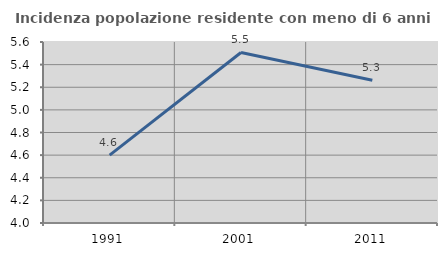
| Category | Incidenza popolazione residente con meno di 6 anni |
|---|---|
| 1991.0 | 4.6 |
| 2001.0 | 5.507 |
| 2011.0 | 5.262 |